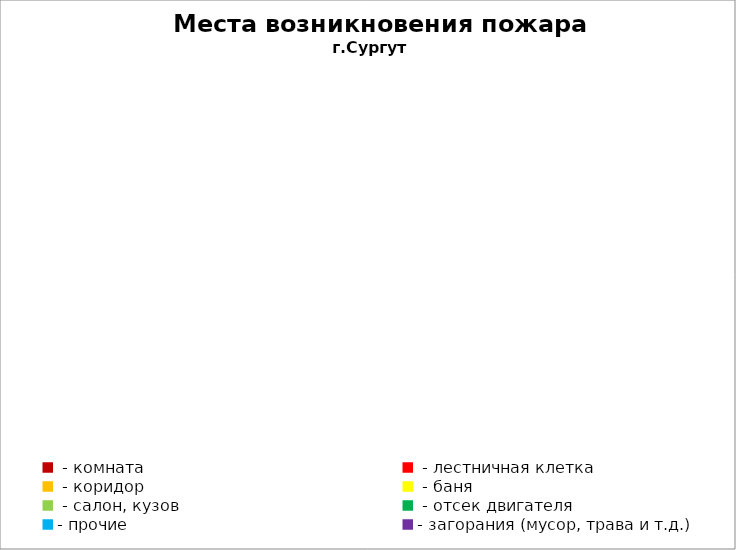
| Category | Места возникновения пожара |
|---|---|
|  - комната | 14 |
|  - лестничная клетка | 1 |
|  - коридор | 2 |
|  - баня | 3 |
|  - салон, кузов | 3 |
|  - отсек двигателя | 17 |
| - прочие | 53 |
| - загорания (мусор, трава и т.д.)  | 18 |